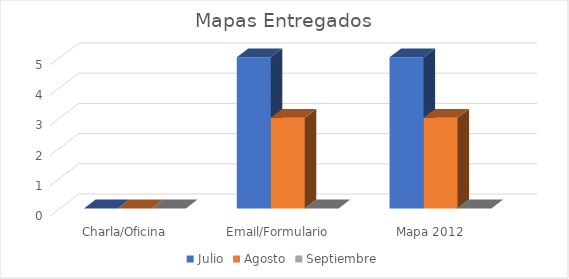
| Category | Julio | Agosto | Septiembre |
|---|---|---|---|
| Charla/Oficina | 0 | 0 | 0 |
| Email/Formulario | 5 | 3 | 0 |
| Mapa 2012 | 5 | 3 | 0 |